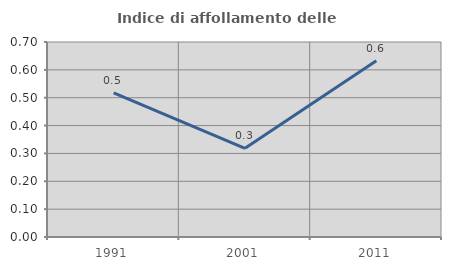
| Category | Indice di affollamento delle abitazioni  |
|---|---|
| 1991.0 | 0.518 |
| 2001.0 | 0.318 |
| 2011.0 | 0.633 |